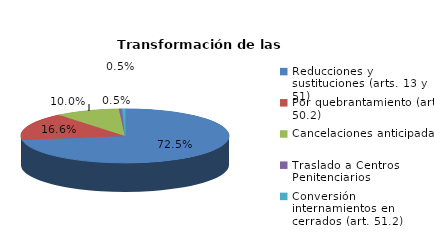
| Category | Series 0 |
|---|---|
| Reducciones y sustituciones (arts. 13 y 51) | 153 |
| Por quebrantamiento (art. 50.2) | 35 |
| Cancelaciones anticipadas | 21 |
| Traslado a Centros Penitenciarios | 1 |
| Conversión internamientos en cerrados (art. 51.2) | 1 |